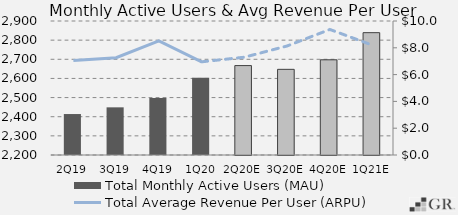
| Category | Total Monthly Active Users (MAU)  |
|---|---|
|  2Q19  | 2414 |
|  3Q19  | 2449 |
|  4Q19  | 2497.8 |
|  1Q20  | 2603 |
|  2Q20E  | 2667.08 |
|  3Q20E  | 2647.495 |
|  4Q20E  | 2697.279 |
|  1Q21E  | 2839.031 |